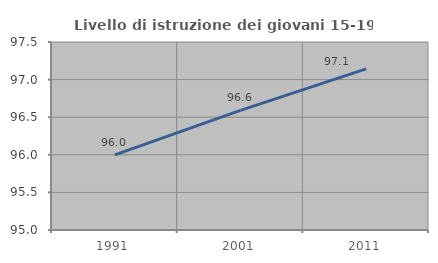
| Category | Livello di istruzione dei giovani 15-19 anni |
|---|---|
| 1991.0 | 96 |
| 2001.0 | 96.591 |
| 2011.0 | 97.143 |